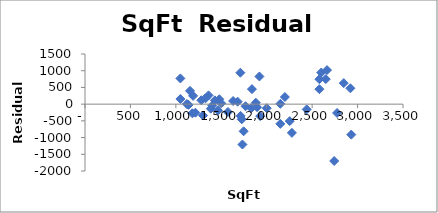
| Category | Series 0 |
|---|---|
| 2580.0 | 447.694 |
| 2774.0 | -263.991 |
| 2150.0 | 10.192 |
| 1837.0 | 449.406 |
| 1880.0 | 43.156 |
| 2150.0 | -589.808 |
| 1830.0 | -120.74 |
| 1767.0 | -62.048 |
| 1630.0 | 93.678 |
| 1680.0 | 74.574 |
| 1725.0 | -452.92 |
| 1500.0 | 24.55 |
| 1430.0 | 113.096 |
| 1360.0 | 261.642 |
| 1400.0 | -48.242 |
| 1573.0 | -235.363 |
| 1385.0 | -136.41 |
| 2931.0 | -912.159 |
| 2200.0 | 213.088 |
| 1478.0 | 146.236 |
| 1713.0 | -352.455 |
| 1326.0 | 174.793 |
| 1050.0 | 769.489 |
| 1190.0 | 247.397 |
| 1156.0 | 397.548 |
| 1746.0 | -812.484 |
| 1280.0 | 116.409 |
| 1215.0 | -255.655 |
| 1121.0 | 3.821 |
| 1050.0 | 154.489 |
| 1733.0 | -1207.897 |
| 1299.0 | -340.911 |
| 1140.0 | -21.499 |
| 1181.0 | -273.504 |
| 2650.0 | 749.148 |
| 2600.0 | 945.252 |
| 2664.0 | 1019.439 |
| 2921.0 | 474.062 |
| 2580.0 | 744.694 |
| 1920.0 | 828.272 |
| 1710.0 | 940.911 |
| 1894.0 | -91.553 |
| 1928.0 | -358.704 |
| 2277.0 | -859.313 |
| 2000.0 | -121.495 |
| 1464.0 | -187.055 |
| 2848.0 | 628.974 |
| 2440.0 | -158.214 |
| 2253.0 | -508.383 |
| 2743.0 | -1701.206 |